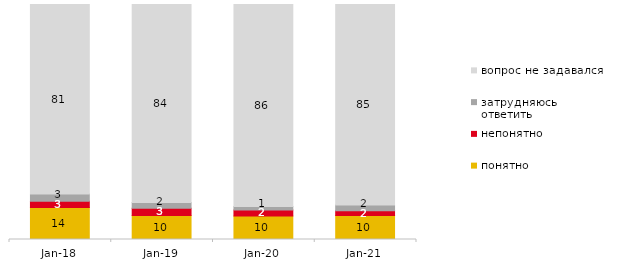
| Category | понятно | непонятно | затрудняюсь ответить | вопрос не задавался |
|---|---|---|---|---|
| 2018-01-01 | 13.65 | 2.6 | 3.15 | 80.6 |
| 2019-01-01 | 10.2 | 3.1 | 2.45 | 84.25 |
| 2020-01-01 | 10.05 | 2.475 | 1.485 | 85.99 |
| 2021-01-01 | 10.233 | 2.037 | 2.385 | 85.345 |